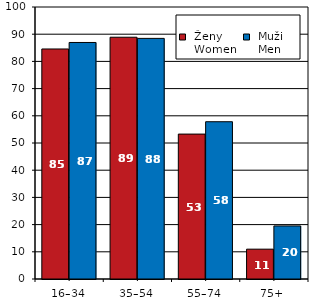
| Category |  Ženy 
 Women |  Muži 
 Men |
|---|---|---|
| 16–34 | 84.57 | 86.96 |
| 35–54 | 88.89 | 88.46 |
| 55–74 | 53.28 | 57.82 |
| 75+ | 10.97 | 19.51 |